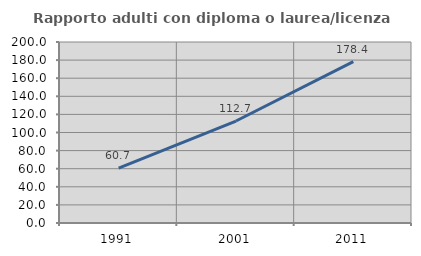
| Category | Rapporto adulti con diploma o laurea/licenza media  |
|---|---|
| 1991.0 | 60.726 |
| 2001.0 | 112.673 |
| 2011.0 | 178.375 |